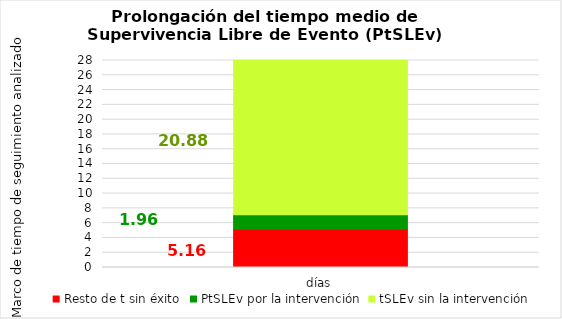
| Category | Resto de t sin éxito | PtSLEv por la intervención | tSLEv sin la intervención |
|---|---|---|---|
| días | 5.162 | 1.958 | 20.88 |